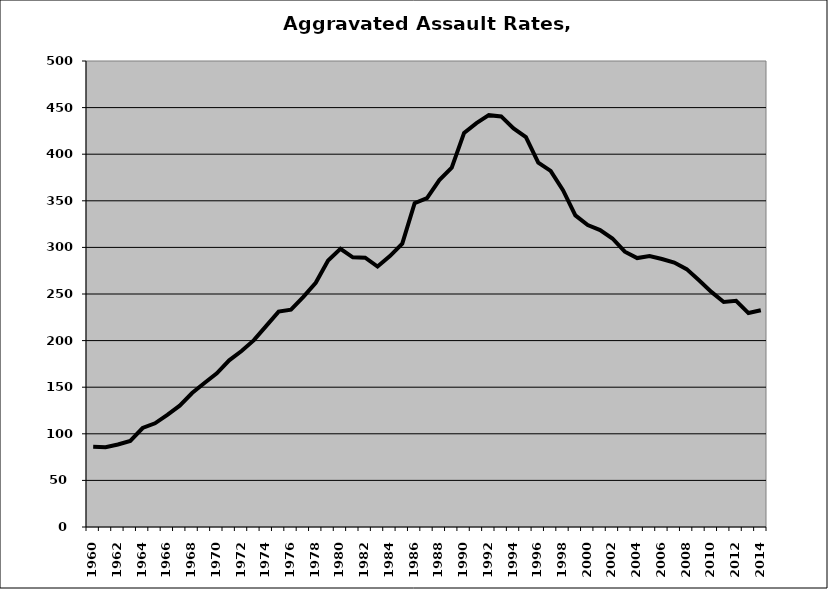
| Category | Aggravated Assault |
|---|---|
| 1960.0 | 86.057 |
| 1961.0 | 85.665 |
| 1962.0 | 88.588 |
| 1963.0 | 92.427 |
| 1964.0 | 106.23 |
| 1965.0 | 111.267 |
| 1966.0 | 120.327 |
| 1967.0 | 130.236 |
| 1968.0 | 143.782 |
| 1969.0 | 154.475 |
| 1970.0 | 164.819 |
| 1971.0 | 178.826 |
| 1972.0 | 188.777 |
| 1973.0 | 200.452 |
| 1974.0 | 215.812 |
| 1975.0 | 231.142 |
| 1976.0 | 233.174 |
| 1977.0 | 247.005 |
| 1978.0 | 262.067 |
| 1979.0 | 285.999 |
| 1980.0 | 298.492 |
| 1981.0 | 289.324 |
| 1982.0 | 288.987 |
| 1983.0 | 279.434 |
| 1984.0 | 290.618 |
| 1985.0 | 303.982 |
| 1986.0 | 347.442 |
| 1987.0 | 352.921 |
| 1988.0 | 372.227 |
| 1989.0 | 385.589 |
| 1990.0 | 422.851 |
| 1991.0 | 433.363 |
| 1992.0 | 441.899 |
| 1993.0 | 440.529 |
| 1994.0 | 427.608 |
| 1995.0 | 418.262 |
| 1996.0 | 391.002 |
| 1997.0 | 382.1 |
| 1998.0 | 361.365 |
| 1999.0 | 334.349 |
| 2000.0 | 323.964 |
| 2001.0 | 318.6 |
| 2002.0 | 309.544 |
| 2003.0 | 295.414 |
| 2004.0 | 288.562 |
| 2005.0 | 290.792 |
| 2006.0 | 287.528 |
| 2007.0 | 283.752 |
| 2008.0 | 276.677 |
| 2009.0 | 264.657 |
| 2010.0 | 252.279 |
| 2011.0 | 241.48 |
| 2012.0 | 242.776 |
| 2013.0 | 229.567 |
| 2014.0 | 232.484 |